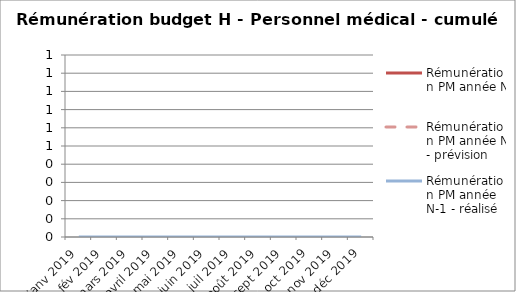
| Category | Rémunération PM année N | Rémunération PM année N - prévision | Rémunération PM année N-1 - réalisé |
|---|---|---|---|
| janv 2019 |  |  | 0 |
| fév 2019 |  |  | 0 |
| mars 2019 |  |  | 0 |
| avril 2019 |  |  | 0 |
| mai 2019 |  |  | 0 |
| juin 2019 |  |  | 0 |
| juil 2019 |  |  | 0 |
| août 2019 |  |  | 0 |
| sept 2019 |  |  | 0 |
| oct 2019 |  |  | 0 |
| nov 2019 |  |  | 0 |
| déc 2019 |  |  | 0 |